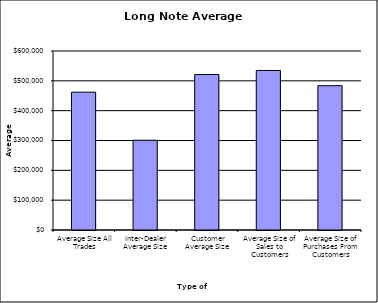
| Category | Security Type |
|---|---|
| Average Size All Trades | 461986.007 |
| Inter-Dealer Average Size | 300855.837 |
| Customer Average Size | 521195.894 |
| Average Size of Sales to Customers | 534776.261 |
| Average Size of Purchases From Customers | 483749.856 |